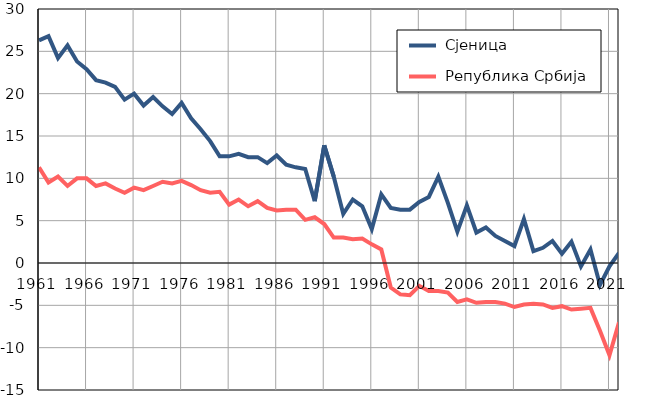
| Category |  Сјеница |  Република Србија |
|---|---|---|
| 1961.0 | 26.3 | 11.3 |
| 1962.0 | 26.8 | 9.5 |
| 1963.0 | 24.2 | 10.2 |
| 1964.0 | 25.7 | 9.1 |
| 1965.0 | 23.8 | 10 |
| 1966.0 | 22.9 | 10 |
| 1967.0 | 21.6 | 9.1 |
| 1968.0 | 21.3 | 9.4 |
| 1969.0 | 20.8 | 8.8 |
| 1970.0 | 19.3 | 8.3 |
| 1971.0 | 20 | 8.9 |
| 1972.0 | 18.6 | 8.6 |
| 1973.0 | 19.6 | 9.1 |
| 1974.0 | 18.5 | 9.6 |
| 1975.0 | 17.6 | 9.4 |
| 1976.0 | 18.9 | 9.7 |
| 1977.0 | 17.1 | 9.2 |
| 1978.0 | 15.8 | 8.6 |
| 1979.0 | 14.4 | 8.3 |
| 1980.0 | 12.6 | 8.4 |
| 1981.0 | 12.6 | 6.9 |
| 1982.0 | 12.9 | 7.5 |
| 1983.0 | 12.5 | 6.7 |
| 1984.0 | 12.5 | 7.3 |
| 1985.0 | 11.8 | 6.5 |
| 1986.0 | 12.7 | 6.2 |
| 1987.0 | 11.6 | 6.3 |
| 1988.0 | 11.3 | 6.3 |
| 1989.0 | 11.1 | 5.1 |
| 1990.0 | 7.3 | 5.4 |
| 1991.0 | 13.9 | 4.6 |
| 1992.0 | 10.2 | 3 |
| 1993.0 | 5.8 | 3 |
| 1994.0 | 7.5 | 2.8 |
| 1995.0 | 6.7 | 2.9 |
| 1996.0 | 4 | 2.2 |
| 1997.0 | 8.1 | 1.6 |
| 1998.0 | 6.5 | -2.9 |
| 1999.0 | 6.3 | -3.7 |
| 2000.0 | 6.3 | -3.8 |
| 2001.0 | 7.2 | -2.7 |
| 2002.0 | 7.8 | -3.3 |
| 2003.0 | 10.2 | -3.3 |
| 2004.0 | 7.1 | -3.5 |
| 2005.0 | 3.7 | -4.6 |
| 2006.0 | 6.8 | -4.3 |
| 2007.0 | 3.6 | -4.7 |
| 2008.0 | 4.2 | -4.6 |
| 2009.0 | 3.2 | -4.6 |
| 2010.0 | 2.6 | -4.8 |
| 2011.0 | 2 | -5.2 |
| 2012.0 | 5.2 | -4.9 |
| 2013.0 | 1.4 | -4.8 |
| 2014.0 | 1.8 | -4.9 |
| 2015.0 | 2.6 | -5.3 |
| 2016.0 | 1.1 | -5.1 |
| 2017.0 | 2.5 | -5.5 |
| 2018.0 | -0.4 | -5.4 |
| 2019.0 | 1.6 | -5.3 |
| 2020.0 | -2.6 | -8 |
| 2021.0 | -0.4 | -10.9 |
| 2022.0 | 1.2 | -7 |